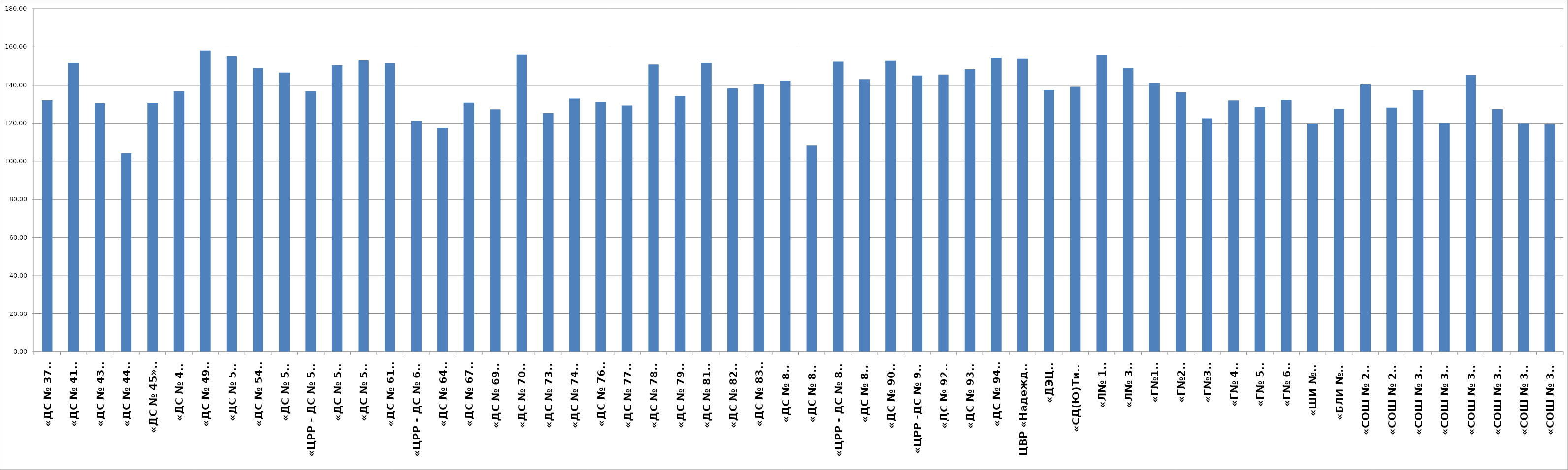
| Category | Series 0 |
|---|---|
| «ДС № 37»  | 131.944 |
| «ДС № 41»  | 151.864 |
| «ДС № 43»  | 130.46 |
| «ДС № 44»  | 104.377 |
| «ДС № 45»    | 130.67 |
| «ДС № 47» | 136.97 |
| «ДС № 49»  | 158.115 |
| «ДС № 51» | 155.283 |
| «ДС № 54»  | 148.909 |
| «ДС № 55» | 146.513 |
| «ЦРР - ДС № 56»  | 136.97 |
| «ДС № 58» | 150.341 |
| «ДС № 59» | 153.136 |
| «ДС № 61»  | 151.516 |
| «ЦРР - ДС № 62»  | 121.307 |
| «ДС № 64»  | 117.5 |
| «ДС № 67»  | 130.759 |
| «ДС № 69»   | 127.261 |
| «ДС № 70»   | 156.07 |
| «ДС № 73»   | 125.274 |
| «ДС № 74»   | 132.868 |
| «ДС № 76»  | 131 |
| «ДС № 77»   | 129.235 |
| «ДС № 78»   | 150.773 |
| «ДС № 79»   | 134.229 |
| «ДС № 81»   | 151.856 |
| «ДС № 82»   | 138.486 |
| «ДС № 83»  | 140.457 |
|   «ДС № 85»  | 142.315 |
|   «ДС № 86»  | 108.375 |
|   «ЦРР - ДС № 87»  | 152.485 |
|   «ДС № 88»  | 142.995 |
|   «ДС № 90»   | 152.958 |
|   «ЦРР -ДС № 91»  | 144.933 |
|   «ДС № 92»   | 145.45 |
|   «ДС № 93»   | 148.214 |
|  «ДС № 94»  | 154.445 |
| ЦВР «Надежда»  | 154.011 |
|  «ДЭЦ»  | 137.667 |
| «СД(Ю)ТиЭ»  | 139.35 |
|  «Л№ 1»  | 155.712 |
|  «Л№ 3»  | 148.9 |
|  «Г№1»  | 141.17 |
|  «Г№2»  | 136.351 |
|  «Г№3»  | 122.532 |
|  «Г№ 4»  | 131.913 |
|  «Г№ 5»  | 128.455 |
|  «Г№ 6»  | 132.15 |
|  «ШИ №1»  | 119.839 |
|  «БЛИ №3»  | 127.417 |
|  «СОШ № 26»  | 140.5 |
|  «СОШ № 29»  | 128.171 |
|  «СОШ № 30»  | 137.47 |
|  «СОШ № 31»  | 120.136 |
|  «СОШ № 32»  | 145.251 |
|  «СОШ № 33»  | 127.292 |
|  «СОШ № 34»  | 119.945 |
|  «СОШ № 35»  | 119.637 |